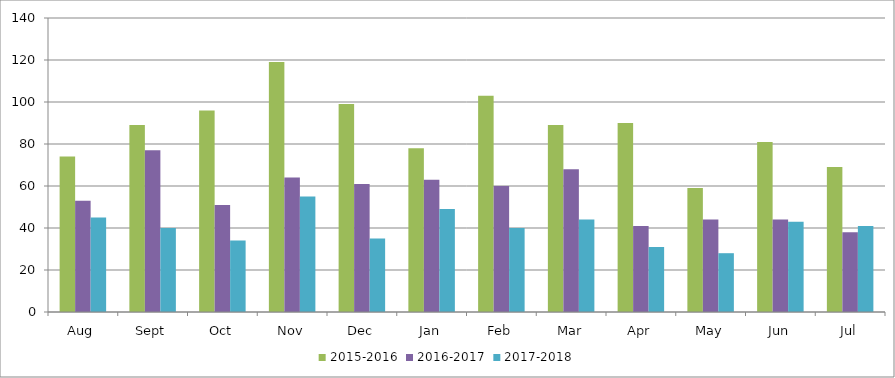
| Category | 2015-2016 | 2016-2017 | 2017-2018 |
|---|---|---|---|
| Aug | 74 | 53 | 45 |
| Sept | 89 | 77 | 40 |
| Oct | 96 | 51 | 34 |
| Nov | 119 | 64 | 55 |
| Dec | 99 | 61 | 35 |
| Jan | 78 | 63 | 49 |
| Feb | 103 | 60 | 40 |
| Mar | 89 | 68 | 44 |
| Apr | 90 | 41 | 31 |
| May | 59 | 44 | 28 |
| Jun | 81 | 44 | 43 |
| Jul | 69 | 38 | 41 |